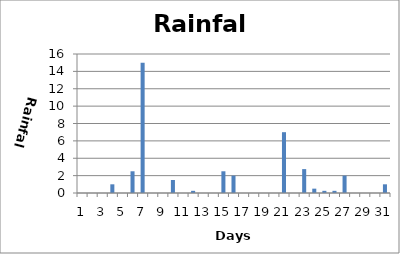
| Category | Series 0 |
|---|---|
| 0 | 0 |
| 1 | 0 |
| 2 | 0 |
| 3 | 1 |
| 4 | 0 |
| 5 | 2.5 |
| 6 | 15 |
| 7 | 0 |
| 8 | 0 |
| 9 | 1.5 |
| 10 | 0 |
| 11 | 0.25 |
| 12 | 0 |
| 13 | 0 |
| 14 | 2.5 |
| 15 | 2 |
| 16 | 0 |
| 17 | 0 |
| 18 | 0 |
| 19 | 0 |
| 20 | 7 |
| 21 | 0 |
| 22 | 2.75 |
| 23 | 0.5 |
| 24 | 0.25 |
| 25 | 0.25 |
| 26 | 2 |
| 27 | 0 |
| 28 | 0 |
| 29 | 0 |
| 30 | 1 |